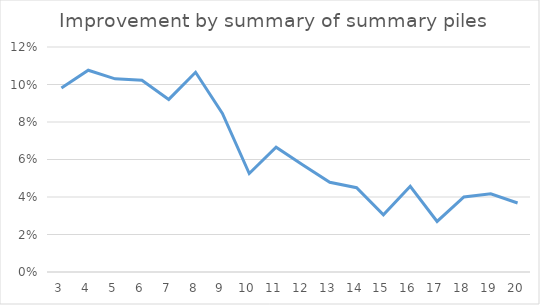
| Category | Series 0 |
|---|---|
| 3.0 | 0.098 |
| 4.0 | 0.108 |
| 5.0 | 0.103 |
| 6.0 | 0.102 |
| 7.0 | 0.092 |
| 8.0 | 0.107 |
| 9.0 | 0.085 |
| 10.0 | 0.053 |
| 11.0 | 0.067 |
| 12.0 | 0.057 |
| 13.0 | 0.048 |
| 14.0 | 0.045 |
| 15.0 | 0.03 |
| 16.0 | 0.046 |
| 17.0 | 0.027 |
| 18.0 | 0.04 |
| 19.0 | 0.042 |
| 20.0 | 0.037 |